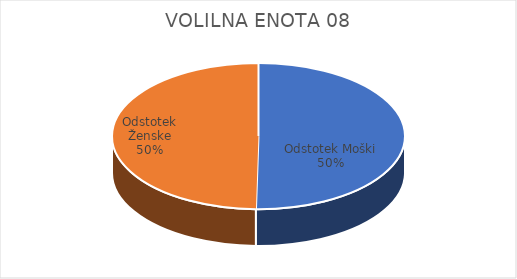
| Category | VOLILNA ENOTA 08 | #REF! | Slovenija skupaj |
|---|---|---|---|
| Odstotek Moški | 24.54 |  | 25.26 |
| Odstotek Ženske | 24.27 |  | 26.62 |